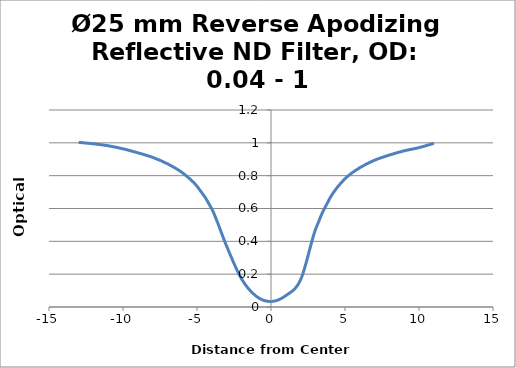
| Category | Optical Density |
|---|---|
| -12.99 | 1.003 |
| -11.99 | 0.994 |
| -10.99 | 0.982 |
| -9.99 | 0.963 |
| -8.99 | 0.939 |
| -7.99 | 0.911 |
| -6.99 | 0.872 |
| -5.99 | 0.818 |
| -4.99 | 0.735 |
| -3.99 | 0.596 |
| -2.99 | 0.369 |
| -1.99 | 0.171 |
| -0.99 | 0.065 |
| 0.01 | 0.033 |
| 1.01 | 0.07 |
| 2.01 | 0.168 |
| 3.01 | 0.474 |
| 4.01 | 0.668 |
| 5.01 | 0.782 |
| 6.01 | 0.849 |
| 7.01 | 0.895 |
| 8.01 | 0.926 |
| 9.01 | 0.952 |
| 10.01 | 0.971 |
| 11.01 | 0.998 |